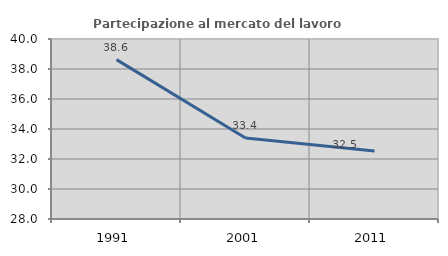
| Category | Partecipazione al mercato del lavoro  femminile |
|---|---|
| 1991.0 | 38.625 |
| 2001.0 | 33.403 |
| 2011.0 | 32.533 |